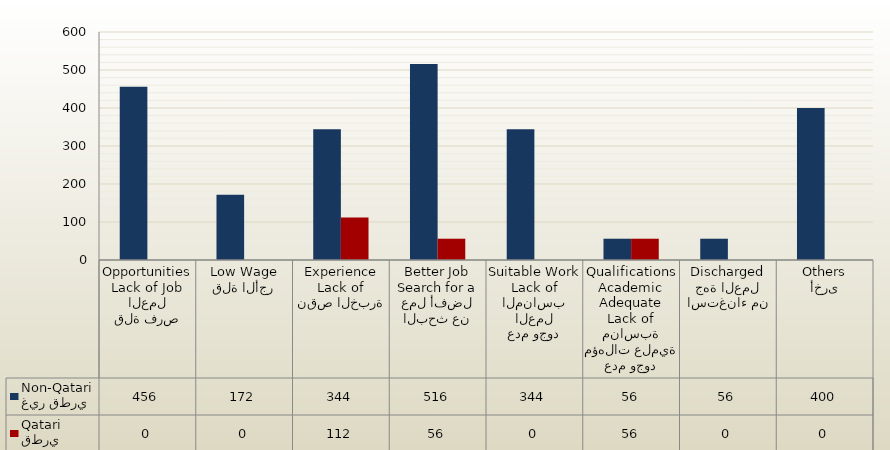
| Category | غير قطري
Non-Qatari | قطري
Qatari |
|---|---|---|
| قلة فرص العمل
Lack of Job Opportunities | 456 | 0 |
| قلة الأجر
Low Wage | 172 | 0 |
| نقص الخبرة
Lack of Experience | 344 | 112 |
| البحث عن عمل أفضل
Search for a Better Job | 516 | 56 |
| عدم وجود العمل المناسب
Lack of Suitable Work | 344 | 0 |
| عدم وجود مؤهلات علمية مناسبة
Lack of Adequate Academic Qualifications | 56 | 56 |
| استغناء من جهة العمل
Discharged | 56 | 0 |
| أخرى
Others | 400 | 0 |